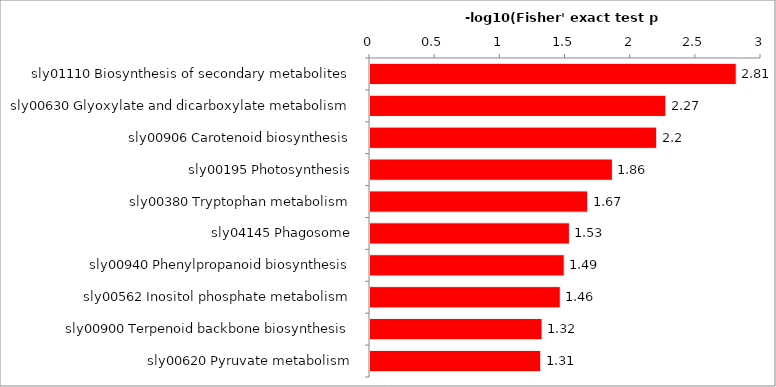
| Category | Series 0 |
|---|---|
| sly01110 Biosynthesis of secondary metabolites | 2.81 |
| sly00630 Glyoxylate and dicarboxylate metabolism | 2.27 |
| sly00906 Carotenoid biosynthesis | 2.2 |
| sly00195 Photosynthesis | 1.86 |
| sly00380 Tryptophan metabolism | 1.67 |
| sly04145 Phagosome | 1.53 |
| sly00940 Phenylpropanoid biosynthesis | 1.49 |
| sly00562 Inositol phosphate metabolism | 1.46 |
| sly00900 Terpenoid backbone biosynthesis | 1.32 |
| sly00620 Pyruvate metabolism | 1.31 |